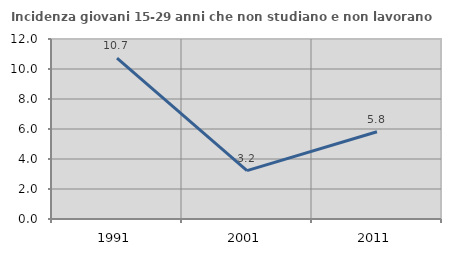
| Category | Incidenza giovani 15-29 anni che non studiano e non lavorano  |
|---|---|
| 1991.0 | 10.72 |
| 2001.0 | 3.226 |
| 2011.0 | 5.814 |